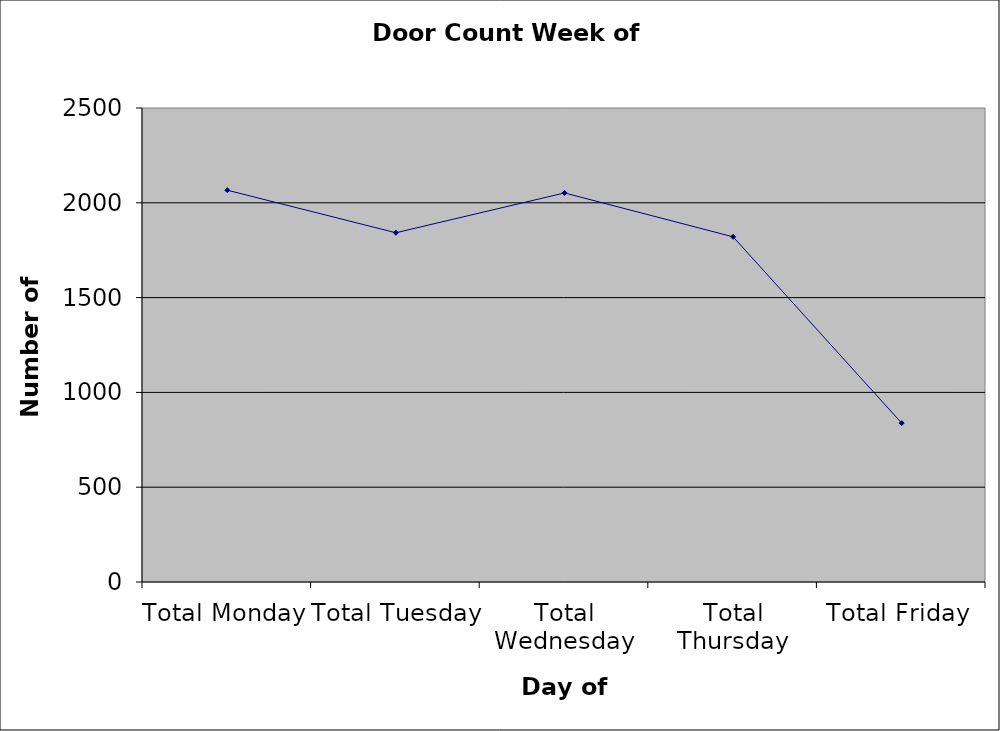
| Category | Series 0 |
|---|---|
| Total Monday | 2066.5 |
| Total Tuesday | 1842 |
| Total Wednesday | 2052 |
| Total Thursday | 1820.5 |
| Total Friday | 838 |